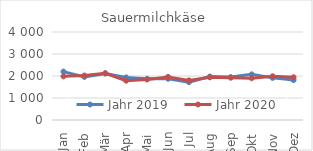
| Category | Jahr 2019 | Jahr 2020 |
|---|---|---|
| Jan | 2200.754 | 1983.289 |
| Feb | 1958.274 | 2022.197 |
| Mär | 2115.07 | 2126.179 |
| Apr | 1934.601 | 1787.897 |
| Mai | 1872.534 | 1841.987 |
| Jun | 1875.16 | 1958.532 |
| Jul | 1720.093 | 1800.126 |
| Aug | 1978.045 | 1940.382 |
| Sep | 1949.84 | 1922.628 |
| Okt | 2074.121 | 1898.52 |
| Nov | 1914.871 | 1989.124 |
| Dez | 1813.851 | 1943.18 |